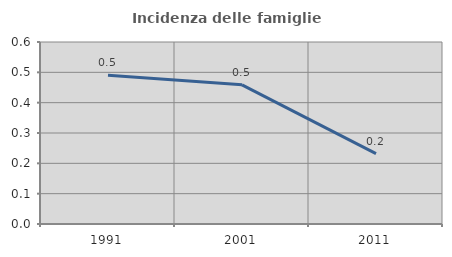
| Category | Incidenza delle famiglie numerose |
|---|---|
| 1991.0 | 0.49 |
| 2001.0 | 0.459 |
| 2011.0 | 0.232 |